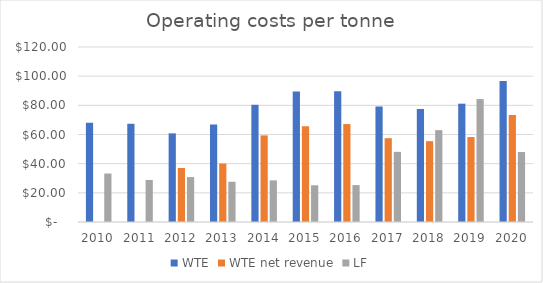
| Category | WTE | WTE net revenue | LF |
|---|---|---|---|
| 2010.0 | 68.062 | 0 | 33.247 |
| 2011.0 | 67.342 | 0 | 28.824 |
| 2012.0 | 60.77 | 37.039 | 30.805 |
| 2013.0 | 66.854 | 40.082 | 27.582 |
| 2014.0 | 80.371 | 59.388 | 28.531 |
| 2015.0 | 89.478 | 65.676 | 25.163 |
| 2016.0 | 89.653 | 67.156 | 25.322 |
| 2017.0 | 79.215 | 57.49 | 48.106 |
| 2018.0 | 77.501 | 55.439 | 62.974 |
| 2019.0 | 81.135 | 58.249 | 84.299 |
| 2020.0 | 96.643 | 73.392 | 47.969 |